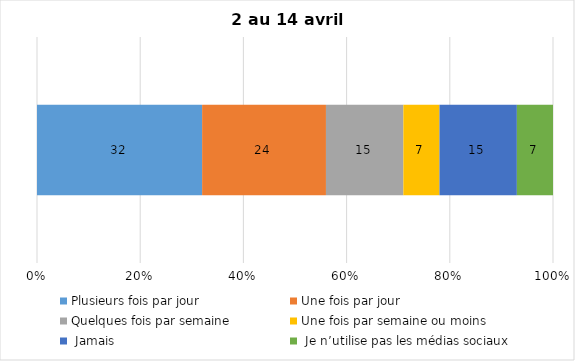
| Category | Plusieurs fois par jour | Une fois par jour | Quelques fois par semaine   | Une fois par semaine ou moins   |  Jamais   |  Je n’utilise pas les médias sociaux |
|---|---|---|---|---|---|---|
| 0 | 32 | 24 | 15 | 7 | 15 | 7 |